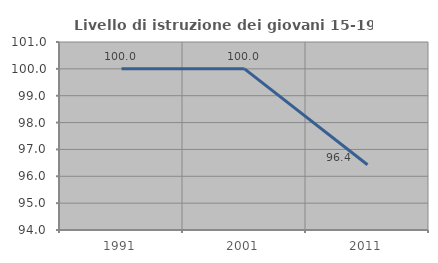
| Category | Livello di istruzione dei giovani 15-19 anni |
|---|---|
| 1991.0 | 100 |
| 2001.0 | 100 |
| 2011.0 | 96.429 |